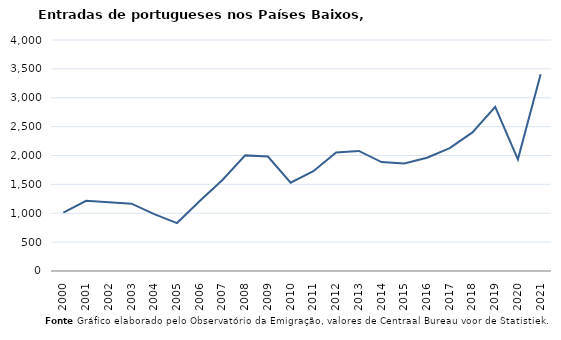
| Category | Entradas |
|---|---|
| 2000.0 | 1009 |
| 2001.0 | 1216 |
| 2002.0 | 1189 |
| 2003.0 | 1166 |
| 2004.0 | 984 |
| 2005.0 | 830 |
| 2006.0 | 1211 |
| 2007.0 | 1577 |
| 2008.0 | 2002 |
| 2009.0 | 1983 |
| 2010.0 | 1530 |
| 2011.0 | 1727 |
| 2012.0 | 2051 |
| 2013.0 | 2079 |
| 2014.0 | 1887 |
| 2015.0 | 1860 |
| 2016.0 | 1961 |
| 2017.0 | 2127 |
| 2018.0 | 2400 |
| 2019.0 | 2841 |
| 2020.0 | 1933 |
| 2021.0 | 3406 |